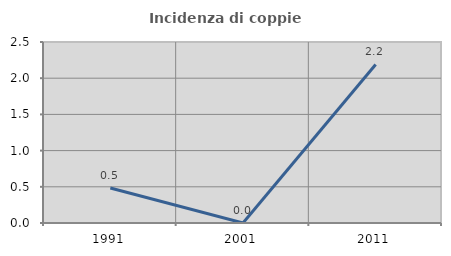
| Category | Incidenza di coppie miste |
|---|---|
| 1991.0 | 0.483 |
| 2001.0 | 0 |
| 2011.0 | 2.19 |